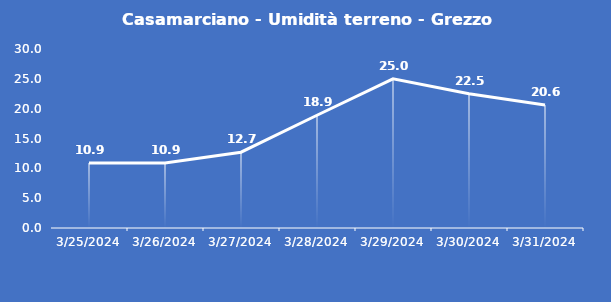
| Category | Casamarciano - Umidità terreno - Grezzo (%VWC) |
|---|---|
| 3/25/24 | 10.9 |
| 3/26/24 | 10.9 |
| 3/27/24 | 12.7 |
| 3/28/24 | 18.9 |
| 3/29/24 | 25 |
| 3/30/24 | 22.5 |
| 3/31/24 | 20.6 |